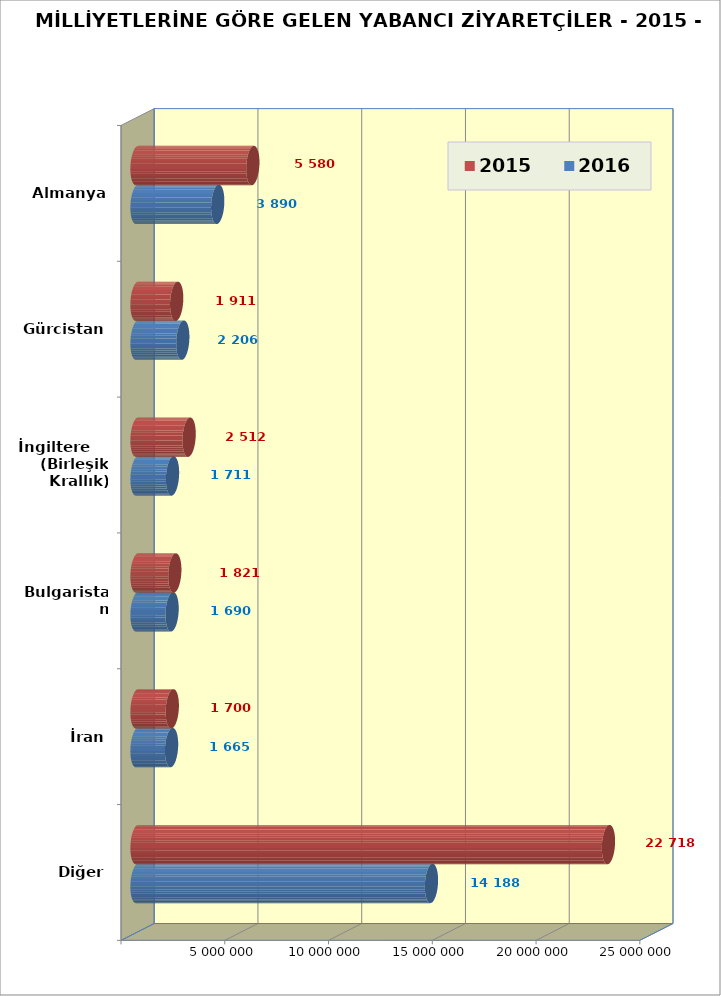
| Category | 2016 | 2015 |
|---|---|---|
| Diğer | 14188466 | 22718004 |
| İran | 1665160 | 1700385 |
| Bulgaristan | 1690766 | 1821480 |
| İngiltere       (Birleşik Krallık) | 1711481 | 2512139 |
| Gürcistan | 2206266 | 1911832 |
| Almanya | 3890074 | 5580792 |